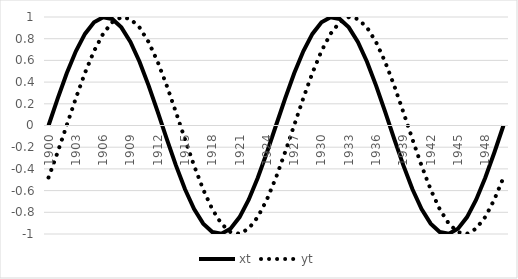
| Category | xt | yt |
|---|---|---|
| 1900-01-01 | 0 | -0.479 |
| 1901-01-01 | 0.249 | -0.246 |
| 1902-01-01 | 0.482 | 0.003 |
| 1903-01-01 | 0.685 | 0.251 |
| 1904-01-01 | 0.844 | 0.484 |
| 1905-01-01 | 0.951 | 0.686 |
| 1906-01-01 | 0.998 | 0.846 |
| 1907-01-01 | 0.982 | 0.952 |
| 1908-01-01 | 0.905 | 0.998 |
| 1909-01-01 | 0.771 | 0.982 |
| 1910-01-01 | 0.588 | 0.904 |
| 1911-01-01 | 0.368 | 0.769 |
| 1912-01-01 | 0.125 | 0.586 |
| 1913-01-01 | -0.125 | 0.366 |
| 1914-01-01 | -0.368 | 0.123 |
| 1915-01-01 | -0.588 | -0.128 |
| 1916-01-01 | -0.771 | -0.371 |
| 1917-01-01 | -0.905 | -0.59 |
| 1918-01-01 | -0.982 | -0.772 |
| 1919-01-01 | -0.998 | -0.906 |
| 1920-01-01 | -0.951 | -0.983 |
| 1921-01-01 | -0.844 | -0.998 |
| 1922-01-01 | -0.685 | -0.95 |
| 1923-01-01 | -0.482 | -0.843 |
| 1924-01-01 | -0.249 | -0.683 |
| 1925-01-01 | 0 | -0.479 |
| 1926-01-01 | 0.249 | -0.246 |
| 1927-01-01 | 0.482 | 0.003 |
| 1928-01-01 | 0.685 | 0.251 |
| 1929-01-01 | 0.844 | 0.484 |
| 1930-01-01 | 0.951 | 0.686 |
| 1931-01-01 | 0.998 | 0.846 |
| 1932-01-01 | 0.982 | 0.952 |
| 1933-01-01 | 0.905 | 0.998 |
| 1934-01-01 | 0.771 | 0.982 |
| 1935-01-01 | 0.588 | 0.904 |
| 1936-01-01 | 0.368 | 0.769 |
| 1937-01-01 | 0.125 | 0.586 |
| 1938-01-01 | -0.125 | 0.366 |
| 1939-01-01 | -0.368 | 0.123 |
| 1940-01-01 | -0.588 | -0.128 |
| 1941-01-01 | -0.771 | -0.371 |
| 1942-01-01 | -0.905 | -0.59 |
| 1943-01-01 | -0.982 | -0.772 |
| 1944-01-01 | -0.998 | -0.906 |
| 1945-01-01 | -0.951 | -0.983 |
| 1946-01-01 | -0.844 | -0.998 |
| 1947-01-01 | -0.685 | -0.95 |
| 1948-01-01 | -0.482 | -0.843 |
| 1949-01-01 | -0.249 | -0.683 |
| 1950-01-01 | 0 | -0.479 |